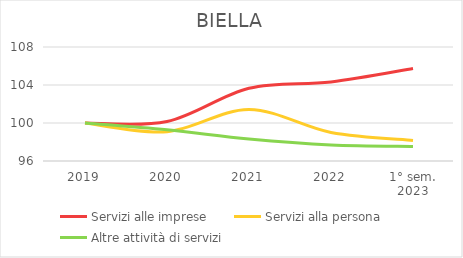
| Category | Servizi alle imprese | Servizi alla persona | Altre attività di servizi |
|---|---|---|---|
| 2019 | 100 | 100 | 100 |
| 2020 | 100.149 | 99.083 | 99.285 |
| 2021 | 103.654 | 101.417 | 98.309 |
| 2022 | 104.325 | 99 | 97.691 |
| 1° sem.
2023 | 105.742 | 98.167 | 97.528 |